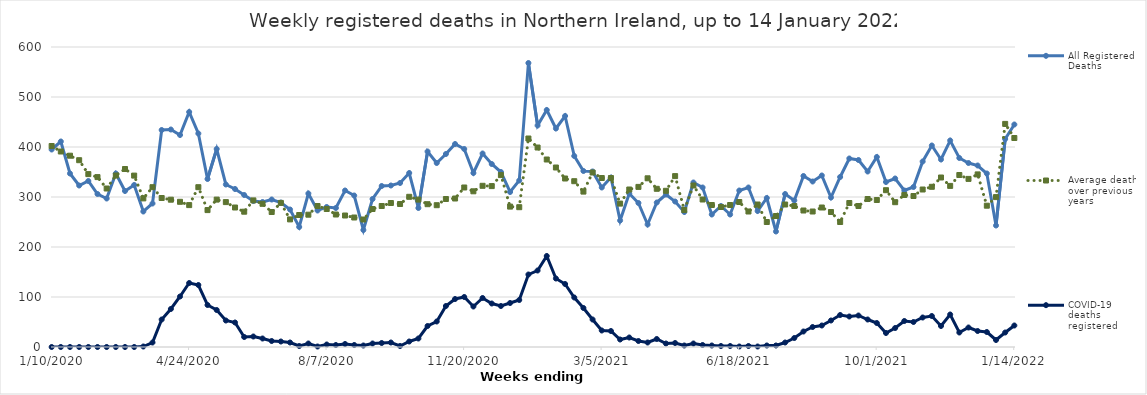
| Category | All Registered Deaths | Average deaths over previous 5 years | COVID-19 deaths registered |
|---|---|---|---|
| 1/10/20 | 395 | 402 | 0 |
| 1/17/20 | 411 | 391 | 0 |
| 1/24/20 | 347 | 382.6 | 0 |
| 1/31/20 | 323 | 373.6 | 0 |
| 2/7/20 | 332 | 345.8 | 0 |
| 2/14/20 | 306 | 339.8 | 0 |
| 2/21/20 | 297 | 317 | 0 |
| 2/28/20 | 347 | 343 | 0 |
| 3/6/20 | 312 | 356 | 0 |
| 3/13/20 | 324 | 342.8 | 0 |
| 3/20/20 | 271 | 297.2 | 1 |
| 3/27/20 | 287 | 319.6 | 9 |
| 4/3/20 | 434 | 298 | 55 |
| 4/10/20 | 435 | 294.6 | 76 |
| 4/17/20 | 424 | 290.4 | 101 |
| 4/24/20 | 470 | 283.8 | 128 |
| 5/1/20 | 427 | 319.6 | 124 |
| 5/8/20 | 336 | 273.8 | 84 |
| 5/15/20 | 396 | 294.8 | 74 |
| 5/22/20 | 325 | 289.8 | 53 |
| 5/29/20 | 316 | 279 | 49 |
| 6/5/20 | 304 | 270.6 | 20 |
| 6/12/20 | 292 | 293.2 | 21 |
| 6/19/20 | 290 | 286.4 | 17 |
| 6/26/20 | 295 | 270 | 12 |
| 7/3/20 | 289 | 288.2 | 11 |
| 7/10/20 | 275 | 255.2 | 9 |
| 7/17/20 | 240 | 264 | 2 |
| 7/24/20 | 307 | 264.6 | 7 |
| 7/31/20 | 273 | 282 | 1 |
| 8/7/20 | 280 | 276 | 5 |
| 8/14/20 | 278 | 265 | 4 |
| 8/21/20 | 313 | 263 | 6 |
| 8/28/20 | 303 | 259 | 4 |
| 9/4/20 | 234 | 255 | 3 |
| 9/11/20 | 296 | 276 | 7 |
| 9/18/20 | 322 | 282 | 8 |
| 9/25/20 | 323 | 288 | 9 |
| 10/2/20 | 328 | 286 | 2 |
| 10/9/20 | 348 | 300.4 | 11 |
| 10/16/20 | 278 | 294.8 | 17 |
| 10/23/20 | 391 | 285.6 | 42 |
| 10/30/20 | 368 | 283.6 | 51 |
| 11/6/20 | 386 | 296 | 82 |
| 11/13/20 | 406 | 297 | 96 |
| 11/20/20 | 396 | 319 | 100 |
| 11/27/20 | 348 | 311.4 | 81 |
| 12/4/20 | 387 | 322.4 | 98 |
| 12/11/20 | 366 | 321.8 | 87 |
| 12/18/20 | 350 | 343.8 | 82 |
| 12/25/20 | 310 | 280.8 | 88 |
| 1/1/21 | 333 | 279.6 | 94 |
| 1/8/21 | 568 | 417 | 145 |
| 1/15/21 | 443 | 399 | 153 |
| 1/22/21 | 474 | 375 | 182 |
| 1/29/21 | 437 | 359 | 137 |
| 2/5/21 | 462 | 337 | 126 |
| 2/12/21 | 382 | 331.6 | 99 |
| 2/19/21 | 352 | 310.8 | 78 |
| 2/26/21 | 351 | 349 | 55 |
| 3/5/21 | 319 | 338 | 33 |
| 3/12/21 | 339 | 338 | 32 |
| 3/19/21 | 253 | 286.8 | 15 |
| 3/26/21 | 307 | 315 | 19 |
| 4/2/21 | 288 | 320.2 | 12 |
| 4/9/21 | 245 | 337.4 | 9 |
| 4/16/21 | 289 | 316.4 | 16 |
| 4/23/21 | 305 | 312.4 | 7 |
| 4/30/21 | 291 | 341.8 | 8 |
| 5/7/21 | 270 | 274 | 3 |
| 5/14/21 | 329 | 323 | 7 |
| 5/21/21 | 319 | 295 | 4 |
| 5/28/21 | 265 | 284 | 3 |
| 6/4/21 | 282 | 280 | 2 |
| 6/11/21 | 265 | 284 | 2 |
| 6/18/21 | 313 | 290 | 1 |
| 6/25/21 | 319 | 271 | 2 |
| 7/2/21 | 272 | 285 | 1 |
| 7/9/21 | 298 | 250 | 3 |
| 7/16/21 | 231 | 262 | 3 |
| 7/23/21 | 306 | 285 | 9 |
| 7/30/21 | 293 | 282 | 18 |
| 8/6/21 | 342 | 273 | 31 |
| 8/13/21 | 331 | 271 | 40 |
| 8/20/21 | 343 | 279 | 43 |
| 8/27/21 | 299 | 270 | 53 |
| 9/3/21 | 340 | 250 | 64 |
| 9/10/21 | 377 | 288 | 61 |
| 9/17/21 | 374 | 282 | 63 |
| 9/24/21 | 351 | 296 | 55 |
| 10/1/21 | 380 | 294 | 48 |
| 10/8/21 | 330 | 313.6 | 28 |
| 10/15/21 | 337 | 289.6 | 38 |
| 10/22/21 | 313 | 304 | 52 |
| 10/29/21 | 320 | 302 | 50 |
| 11/5/21 | 371 | 315 | 59 |
| 11/12/21 | 403 | 320.4 | 62 |
| 11/19/21 | 375 | 339 | 42 |
| 11/26/21 | 413 | 322.2 | 65 |
| 12/3/21 | 378 | 344 | 29 |
| 12/10/21 | 368 | 336.2 | 39 |
| 12/17/21 | 363 | 345.2 | 32 |
| 12/24/21 | 347 | 282.6 | 30 |
| 12/31/21 | 243 | 299.8 | 14 |
| 1/7/22 | 416 | 446.2 | 29 |
| 1/14/22 | 445 | 418 | 43 |